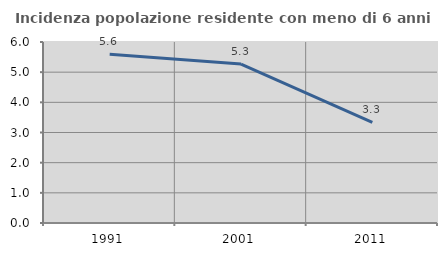
| Category | Incidenza popolazione residente con meno di 6 anni |
|---|---|
| 1991.0 | 5.596 |
| 2001.0 | 5.268 |
| 2011.0 | 3.339 |